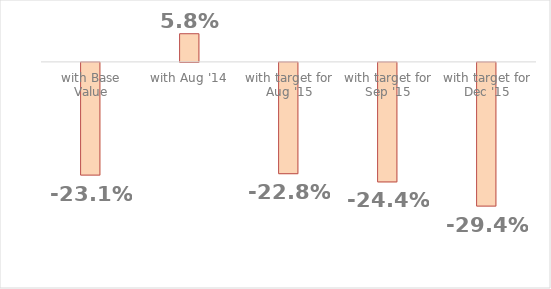
| Category | Series 1 |
|---|---|
| with Base Value | -0.231 |
| with Aug '14 | 0.058 |
| with target for Aug '15 | -0.228 |
| with target for Sep '15 | -0.244 |
| with target for Dec '15 | -0.294 |